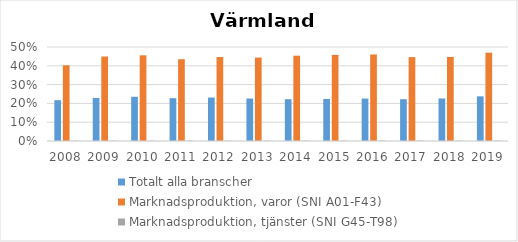
| Category | Totalt alla branscher | Marknadsproduktion, varor (SNI A01-F43) | Marknadsproduktion, tjänster (SNI G45-T98) |
|---|---|---|---|
| 2008 | 0.217 | 0.403 | 0.002 |
| 2009 | 0.229 | 0.449 | 0.002 |
| 2010 | 0.235 | 0.456 | 0.002 |
| 2011 | 0.228 | 0.435 | 0.002 |
| 2012 | 0.231 | 0.447 | 0.002 |
| 2013 | 0.226 | 0.444 | 0.002 |
| 2014 | 0.222 | 0.454 | 0.002 |
| 2015 | 0.224 | 0.458 | 0.002 |
| 2016 | 0.226 | 0.46 | 0.002 |
| 2017 | 0.222 | 0.446 | 0.002 |
| 2018 | 0.226 | 0.447 | 0.002 |
| 2019 | 0.238 | 0.47 | 0.002 |